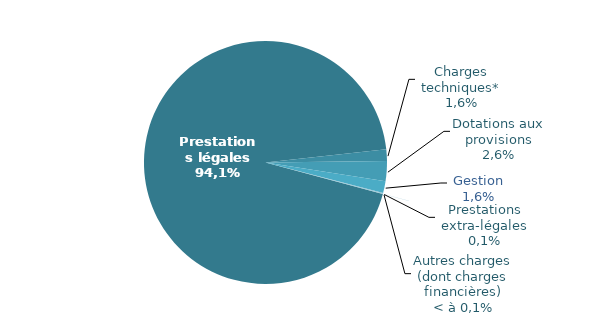
| Category | Series 0 |
|---|---|
| Prestations légales | 6807.025 |
| Charges techniques | 112.402 |
| Dotations aux provisions | 191.405 |
| Gestion | 114.46 |
| Prestations extra-légales | 8.546 |
| Charges financières | 0.732 |
| Autres charges | 0 |